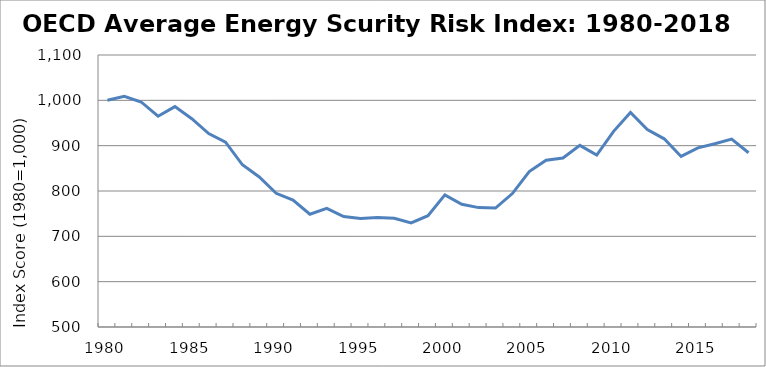
| Category | Total OECD Index |
|---|---|
| 1980.0 | 1000 |
| 1981.0 | 1008.771 |
| 1982.0 | 996.377 |
| 1983.0 | 964.972 |
| 1984.0 | 986.197 |
| 1985.0 | 959.459 |
| 1986.0 | 926.636 |
| 1987.0 | 907.717 |
| 1988.0 | 857.838 |
| 1989.0 | 831.014 |
| 1990.0 | 794.97 |
| 1991.0 | 779.978 |
| 1992.0 | 748.833 |
| 1993.0 | 761.875 |
| 1994.0 | 743.604 |
| 1995.0 | 739.305 |
| 1996.0 | 741.66 |
| 1997.0 | 739.931 |
| 1998.0 | 729.689 |
| 1999.0 | 745.476 |
| 2000.0 | 791.42 |
| 2001.0 | 770.614 |
| 2002.0 | 763.35 |
| 2003.0 | 762.427 |
| 2004.0 | 794.311 |
| 2005.0 | 842.956 |
| 2006.0 | 867.907 |
| 2007.0 | 872.799 |
| 2008.0 | 900.634 |
| 2009.0 | 879.195 |
| 2010.0 | 931.618 |
| 2011.0 | 973.308 |
| 2012.0 | 935.396 |
| 2013.0 | 915.122 |
| 2014.0 | 876.257 |
| 2015.0 | 895.034 |
| 2016.0 | 904.16 |
| 2017.0 | 914.576 |
| 2018.0 | 884.433 |